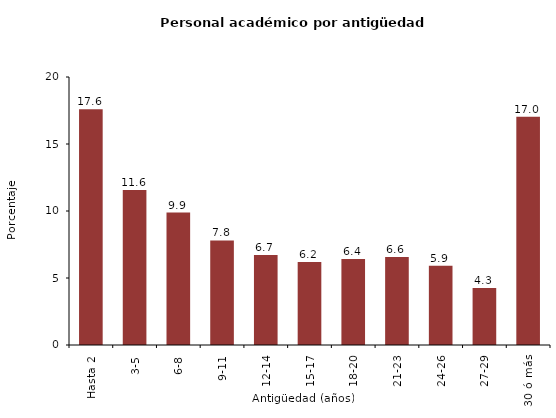
| Category | Series 0 |
|---|---|
| Hasta 2 | 17.589 |
| 3-5 | 11.574 |
| 6-8 | 9.887 |
| 9-11 | 7.799 |
| 12-14 | 6.709 |
| 15-17 | 6.2 |
| 18-20 | 6.415 |
| 21-23 | 6.562 |
| 24-26 | 5.91 |
| 27-29 | 4.26 |
| 30 ó más | 17.042 |